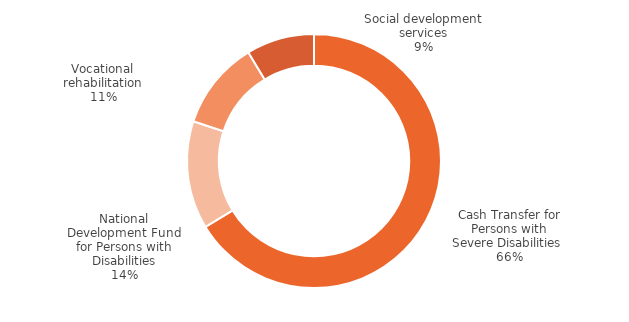
| Category | Series 0 |
|---|---|
| Cash Transfer for Persons with Severe Disabilities  | 5960000000 |
| National Development Fund for Persons with Disabilities | 1236000000 |
| Vocational rehabilitation | 1013658310 |
| Social development services | 778110162 |